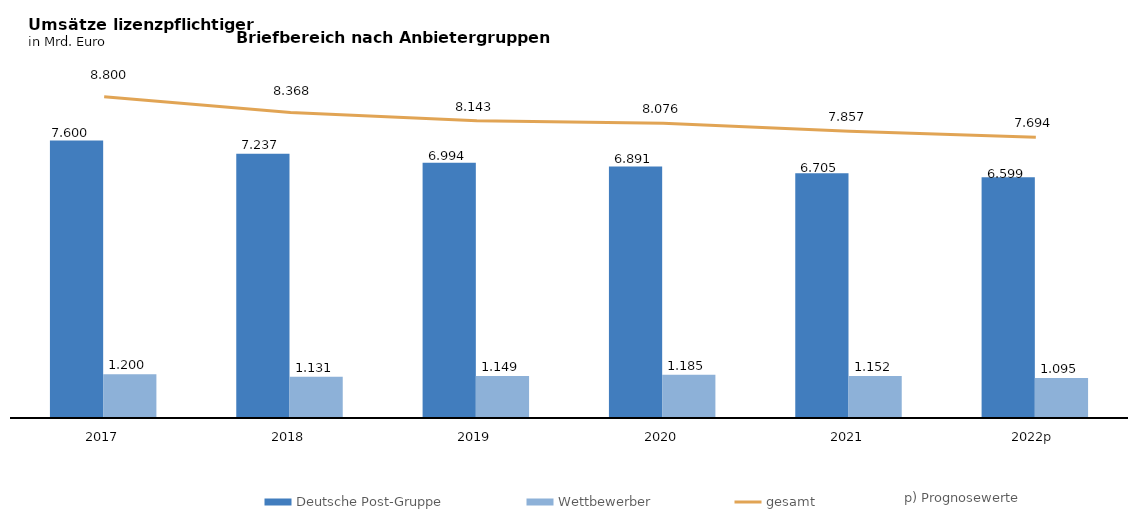
| Category | Deutsche Post-Gruppe | Wettbewerber |
|---|---|---|
| 2017 | 7.6 | 1.2 |
| 2018 | 7.237 | 1.131 |
| 2019 | 6.994 | 1.149 |
| 2020 | 6.891 | 1.185 |
| 2021 | 6.705 | 1.152 |
| 2022p | 6.599 | 1.095 |